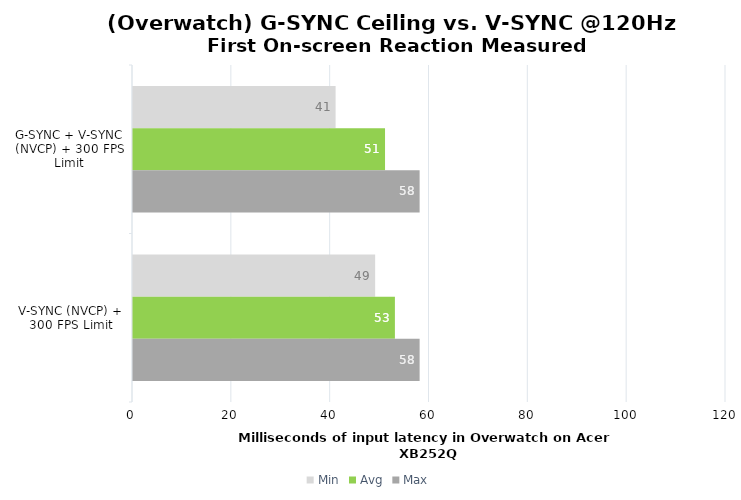
| Category | Min | Avg | Max |
|---|---|---|---|
| G-SYNC + V-SYNC (NVCP) + 300 FPS Limit | 41 | 51 | 58 |
| V-SYNC (NVCP) + 300 FPS Limit | 49 | 53 | 58 |